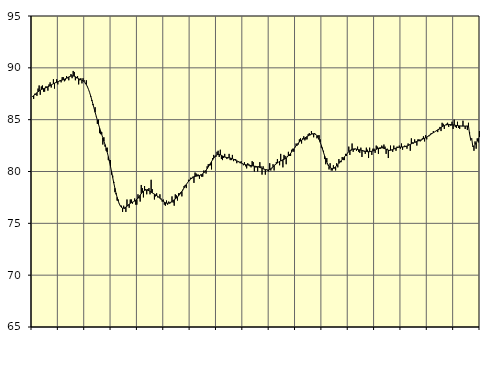
| Category | Piggar | Series 1 |
|---|---|---|
| nan | 87.2 | 87.24 |
| 87.0 | 87 | 87.31 |
| 87.0 | 87.5 | 87.4 |
| 87.0 | 87.4 | 87.5 |
| 87.0 | 87.3 | 87.6 |
| 87.0 | 88 | 87.69 |
| 87.0 | 88.3 | 87.77 |
| 87.0 | 87.4 | 87.84 |
| 87.0 | 88.2 | 87.9 |
| 87.0 | 88.3 | 87.95 |
| 87.0 | 87.7 | 87.99 |
| 87.0 | 87.7 | 88.03 |
| nan | 88.2 | 88.07 |
| 88.0 | 88.2 | 88.11 |
| 88.0 | 87.8 | 88.17 |
| 88.0 | 88.4 | 88.23 |
| 88.0 | 88.6 | 88.29 |
| 88.0 | 88.1 | 88.36 |
| 88.0 | 88.4 | 88.41 |
| 88.0 | 88.9 | 88.47 |
| 88.0 | 88 | 88.52 |
| 88.0 | 88.6 | 88.57 |
| 88.0 | 88.9 | 88.61 |
| 88.0 | 88.4 | 88.66 |
| nan | 88.7 | 88.7 |
| 89.0 | 88.8 | 88.75 |
| 89.0 | 88.6 | 88.79 |
| 89.0 | 89.1 | 88.82 |
| 89.0 | 89.1 | 88.86 |
| 89.0 | 88.7 | 88.9 |
| 89.0 | 88.8 | 88.95 |
| 89.0 | 89.2 | 89 |
| 89.0 | 89 | 89.06 |
| 89.0 | 88.8 | 89.12 |
| 89.0 | 89.2 | 89.17 |
| 89.0 | 89.4 | 89.21 |
| nan | 89 | 89.23 |
| 90.0 | 89.7 | 89.22 |
| 90.0 | 89.6 | 89.19 |
| 90.0 | 88.8 | 89.14 |
| 90.0 | 89 | 89.08 |
| 90.0 | 89.2 | 89.01 |
| 90.0 | 88.4 | 88.95 |
| 90.0 | 88.8 | 88.9 |
| 90.0 | 89 | 88.85 |
| 90.0 | 88.5 | 88.8 |
| 90.0 | 89 | 88.75 |
| 90.0 | 88.8 | 88.66 |
| nan | 88.5 | 88.54 |
| 91.0 | 88.8 | 88.38 |
| 91.0 | 88.2 | 88.17 |
| 91.0 | 87.9 | 87.91 |
| 91.0 | 87.6 | 87.61 |
| 91.0 | 87.2 | 87.27 |
| 91.0 | 86.8 | 86.89 |
| 91.0 | 86.4 | 86.51 |
| 91.0 | 86.1 | 86.11 |
| 91.0 | 86.2 | 85.71 |
| 91.0 | 85.3 | 85.33 |
| 91.0 | 84.6 | 84.95 |
| nan | 85 | 84.58 |
| 92.0 | 83.7 | 84.23 |
| 92.0 | 83.6 | 83.89 |
| 92.0 | 83.8 | 83.57 |
| 92.0 | 82.6 | 83.25 |
| 92.0 | 83.3 | 82.93 |
| 92.0 | 82.4 | 82.6 |
| 92.0 | 82 | 82.25 |
| 92.0 | 82.3 | 81.87 |
| 92.0 | 81.1 | 81.44 |
| 92.0 | 81.1 | 80.98 |
| 92.0 | 81.1 | 80.47 |
| nan | 79.7 | 79.95 |
| 93.0 | 79.6 | 79.42 |
| 93.0 | 79 | 78.89 |
| 93.0 | 78 | 78.39 |
| 93.0 | 77.8 | 77.92 |
| 93.0 | 77.2 | 77.51 |
| 93.0 | 77.3 | 77.16 |
| 93.0 | 76.9 | 76.88 |
| 93.0 | 76.7 | 76.67 |
| 93.0 | 76.7 | 76.54 |
| 93.0 | 76.1 | 76.47 |
| 93.0 | 76.7 | 76.46 |
| nan | 76.4 | 76.5 |
| 94.0 | 76.1 | 76.57 |
| 94.0 | 77.3 | 76.65 |
| 94.0 | 76.7 | 76.75 |
| 94.0 | 76.5 | 76.85 |
| 94.0 | 77.3 | 76.93 |
| 94.0 | 77.3 | 76.99 |
| 94.0 | 76.9 | 77.04 |
| 94.0 | 77.1 | 77.09 |
| 94.0 | 77.4 | 77.15 |
| 94.0 | 76.8 | 77.22 |
| 94.0 | 76.8 | 77.32 |
| nan | 77.8 | 77.44 |
| 95.0 | 77.4 | 77.57 |
| 95.0 | 77.1 | 77.72 |
| 95.0 | 78.7 | 77.86 |
| 95.0 | 78.4 | 77.99 |
| 95.0 | 77.5 | 78.1 |
| 95.0 | 78.6 | 78.18 |
| 95.0 | 78.3 | 78.21 |
| 95.0 | 77.8 | 78.22 |
| 95.0 | 78.3 | 78.19 |
| 95.0 | 78.4 | 78.14 |
| 95.0 | 77.8 | 78.08 |
| nan | 79.2 | 78.01 |
| 96.0 | 78.3 | 77.94 |
| 96.0 | 77.9 | 77.88 |
| 96.0 | 77.3 | 77.82 |
| 96.0 | 77.6 | 77.75 |
| 96.0 | 77.9 | 77.68 |
| 96.0 | 77.5 | 77.61 |
| 96.0 | 77.5 | 77.52 |
| 96.0 | 77.8 | 77.42 |
| 96.0 | 77.4 | 77.32 |
| 96.0 | 77.1 | 77.22 |
| 96.0 | 77.3 | 77.13 |
| nan | 76.8 | 77.05 |
| 97.0 | 76.7 | 76.99 |
| 97.0 | 77.2 | 76.95 |
| 97.0 | 76.8 | 76.94 |
| 97.0 | 77.1 | 76.95 |
| 97.0 | 76.9 | 76.99 |
| 97.0 | 77 | 77.05 |
| 97.0 | 77.6 | 77.12 |
| 97.0 | 77 | 77.19 |
| 97.0 | 76.7 | 77.27 |
| 97.0 | 77.8 | 77.35 |
| 97.0 | 77.7 | 77.44 |
| nan | 77.2 | 77.54 |
| 98.0 | 77.9 | 77.66 |
| 98.0 | 77.9 | 77.79 |
| 98.0 | 78 | 77.93 |
| 98.0 | 77.6 | 78.08 |
| 98.0 | 78.2 | 78.25 |
| 98.0 | 78.6 | 78.42 |
| 98.0 | 78.7 | 78.58 |
| 98.0 | 78.4 | 78.74 |
| 98.0 | 78.9 | 78.9 |
| 98.0 | 79.2 | 79.04 |
| 98.0 | 79.1 | 79.17 |
| nan | 79.4 | 79.28 |
| 99.0 | 79.3 | 79.37 |
| 99.0 | 79.5 | 79.44 |
| 99.0 | 78.9 | 79.49 |
| 99.0 | 79.9 | 79.53 |
| 99.0 | 79.8 | 79.55 |
| 99.0 | 79.7 | 79.57 |
| 99.0 | 79.7 | 79.58 |
| 99.0 | 79.3 | 79.61 |
| 99.0 | 79.7 | 79.65 |
| 99.0 | 79.5 | 79.7 |
| 99.0 | 79.5 | 79.78 |
| nan | 80.1 | 79.87 |
| 0.0 | 80 | 79.98 |
| 0.0 | 79.8 | 80.12 |
| 0.0 | 80.5 | 80.26 |
| 0.0 | 80.7 | 80.43 |
| 0.0 | 80.7 | 80.6 |
| 0.0 | 80.6 | 80.78 |
| 0.0 | 80.2 | 80.96 |
| 0.0 | 81.3 | 81.13 |
| 0.0 | 81.6 | 81.29 |
| 0.0 | 81.4 | 81.43 |
| 0.0 | 81.4 | 81.54 |
| nan | 81.9 | 81.61 |
| 1.0 | 82 | 81.64 |
| 1.0 | 81.4 | 81.64 |
| 1.0 | 82.1 | 81.61 |
| 1.0 | 81.2 | 81.56 |
| 1.0 | 81.1 | 81.5 |
| 1.0 | 81.3 | 81.45 |
| 1.0 | 81.7 | 81.4 |
| 1.0 | 81.4 | 81.37 |
| 1.0 | 81.2 | 81.35 |
| 1.0 | 81.3 | 81.33 |
| 1.0 | 81.7 | 81.32 |
| nan | 81.1 | 81.3 |
| 2.0 | 81.1 | 81.27 |
| 2.0 | 81.6 | 81.23 |
| 2.0 | 81 | 81.18 |
| 2.0 | 81.2 | 81.13 |
| 2.0 | 81.2 | 81.08 |
| 2.0 | 80.8 | 81.03 |
| 2.0 | 81 | 80.98 |
| 2.0 | 80.9 | 80.93 |
| 2.0 | 80.8 | 80.87 |
| 2.0 | 81 | 80.82 |
| 2.0 | 80.8 | 80.77 |
| nan | 80.6 | 80.72 |
| 3.0 | 80.9 | 80.69 |
| 3.0 | 80.5 | 80.66 |
| 3.0 | 80.3 | 80.64 |
| 3.0 | 80.8 | 80.63 |
| 3.0 | 80.7 | 80.61 |
| 3.0 | 80.5 | 80.59 |
| 3.0 | 80.4 | 80.57 |
| 3.0 | 81 | 80.55 |
| 3.0 | 80.9 | 80.53 |
| 3.0 | 80 | 80.51 |
| 3.0 | 80.4 | 80.5 |
| nan | 80.4 | 80.48 |
| 4.0 | 80 | 80.46 |
| 4.0 | 80.5 | 80.43 |
| 4.0 | 80.9 | 80.39 |
| 4.0 | 80.5 | 80.35 |
| 4.0 | 79.7 | 80.31 |
| 4.0 | 80.5 | 80.27 |
| 4.0 | 80.2 | 80.23 |
| 4.0 | 79.7 | 80.19 |
| 4.0 | 80.2 | 80.16 |
| 4.0 | 80.1 | 80.15 |
| 4.0 | 80 | 80.16 |
| nan | 80.8 | 80.2 |
| 5.0 | 80.1 | 80.27 |
| 5.0 | 80.3 | 80.35 |
| 5.0 | 80.7 | 80.45 |
| 5.0 | 80.1 | 80.54 |
| 5.0 | 80.7 | 80.64 |
| 5.0 | 80.9 | 80.74 |
| 5.0 | 81.2 | 80.82 |
| 5.0 | 80.9 | 80.9 |
| 5.0 | 80.6 | 80.97 |
| 5.0 | 81.7 | 81.03 |
| 5.0 | 81 | 81.08 |
| nan | 80.4 | 81.13 |
| 6.0 | 81.6 | 81.18 |
| 6.0 | 81.5 | 81.24 |
| 6.0 | 80.7 | 81.31 |
| 6.0 | 81.5 | 81.4 |
| 6.0 | 81.9 | 81.5 |
| 6.0 | 81.5 | 81.62 |
| 6.0 | 81.5 | 81.75 |
| 6.0 | 82.1 | 81.89 |
| 6.0 | 82.2 | 82.03 |
| 6.0 | 81.9 | 82.18 |
| 6.0 | 82.3 | 82.33 |
| nan | 82.7 | 82.48 |
| 7.0 | 82.5 | 82.62 |
| 7.0 | 82.6 | 82.74 |
| 7.0 | 83.1 | 82.85 |
| 7.0 | 83.2 | 82.94 |
| 7.0 | 82.7 | 83.02 |
| 7.0 | 83.2 | 83.09 |
| 7.0 | 83.4 | 83.16 |
| 7.0 | 83 | 83.23 |
| 7.0 | 83.1 | 83.3 |
| 7.0 | 83.1 | 83.37 |
| 7.0 | 83.6 | 83.43 |
| nan | 83.7 | 83.5 |
| 8.0 | 83.5 | 83.56 |
| 8.0 | 83.9 | 83.6 |
| 8.0 | 83.6 | 83.64 |
| 8.0 | 83.3 | 83.64 |
| 8.0 | 83.7 | 83.62 |
| 8.0 | 83.6 | 83.56 |
| 8.0 | 83.2 | 83.45 |
| 8.0 | 83.5 | 83.29 |
| 8.0 | 83.5 | 83.07 |
| 8.0 | 83.1 | 82.81 |
| 8.0 | 82.3 | 82.51 |
| nan | 82.3 | 82.18 |
| 9.0 | 82 | 81.84 |
| 9.0 | 81.2 | 81.5 |
| 9.0 | 80.7 | 81.19 |
| 9.0 | 81.3 | 80.91 |
| 9.0 | 80.6 | 80.67 |
| 9.0 | 80.2 | 80.49 |
| 9.0 | 80.8 | 80.37 |
| 9.0 | 80.1 | 80.31 |
| 9.0 | 80.1 | 80.29 |
| 9.0 | 80.6 | 80.31 |
| 9.0 | 80.3 | 80.37 |
| nan | 80.1 | 80.45 |
| 10.0 | 80.8 | 80.55 |
| 10.0 | 80.4 | 80.66 |
| 10.0 | 81.2 | 80.78 |
| 10.0 | 81 | 80.9 |
| 10.0 | 80.9 | 81.03 |
| 10.0 | 81.4 | 81.15 |
| 10.0 | 81.1 | 81.28 |
| 10.0 | 81.1 | 81.41 |
| 10.0 | 81.7 | 81.54 |
| 10.0 | 81.5 | 81.67 |
| 10.0 | 81.8 | 81.79 |
| nan | 82.4 | 81.91 |
| 11.0 | 81.6 | 82.01 |
| 11.0 | 82 | 82.08 |
| 11.0 | 82.7 | 82.14 |
| 11.0 | 81.9 | 82.17 |
| 11.0 | 82.1 | 82.18 |
| 11.0 | 82.2 | 82.17 |
| 11.0 | 82 | 82.15 |
| 11.0 | 82.4 | 82.13 |
| 11.0 | 81.9 | 82.11 |
| 11.0 | 81.8 | 82.09 |
| 11.0 | 82.3 | 82.06 |
| nan | 81.4 | 82.03 |
| 12.0 | 82 | 82.01 |
| 12.0 | 81.9 | 81.98 |
| 12.0 | 81.7 | 81.95 |
| 12.0 | 82.3 | 81.93 |
| 12.0 | 82.1 | 81.91 |
| 12.0 | 81.3 | 81.91 |
| 12.0 | 82.3 | 81.91 |
| 12.0 | 81.9 | 81.93 |
| 12.0 | 81.6 | 81.95 |
| 12.0 | 82.2 | 81.98 |
| 12.0 | 82.2 | 82.03 |
| nan | 81.8 | 82.07 |
| 13.0 | 82.5 | 82.13 |
| 13.0 | 82.4 | 82.19 |
| 13.0 | 81.7 | 82.24 |
| 13.0 | 82.2 | 82.28 |
| 13.0 | 82.2 | 82.29 |
| 13.0 | 82.5 | 82.29 |
| 13.0 | 82.4 | 82.27 |
| 13.0 | 82.6 | 82.23 |
| 13.0 | 82.4 | 82.19 |
| 13.0 | 81.7 | 82.14 |
| 13.0 | 82.2 | 82.1 |
| nan | 81.3 | 82.06 |
| 14.0 | 82 | 82.04 |
| 14.0 | 82.5 | 82.05 |
| 14.0 | 82.1 | 82.07 |
| 14.0 | 81.9 | 82.11 |
| 14.0 | 82.5 | 82.16 |
| 14.0 | 82.2 | 82.22 |
| 14.0 | 82 | 82.26 |
| 14.0 | 82.4 | 82.3 |
| 14.0 | 82.3 | 82.33 |
| 14.0 | 82.5 | 82.34 |
| 14.0 | 82.2 | 82.35 |
| nan | 82.7 | 82.36 |
| 15.0 | 82.1 | 82.37 |
| 15.0 | 82.4 | 82.38 |
| 15.0 | 82.5 | 82.4 |
| 15.0 | 82.4 | 82.42 |
| 15.0 | 82.2 | 82.46 |
| 15.0 | 82.7 | 82.5 |
| 15.0 | 82.6 | 82.56 |
| 15.0 | 82 | 82.61 |
| 15.0 | 83.2 | 82.67 |
| 15.0 | 82.8 | 82.72 |
| 15.0 | 82.7 | 82.77 |
| nan | 83.1 | 82.82 |
| 16.0 | 82.8 | 82.86 |
| 16.0 | 82.5 | 82.9 |
| 16.0 | 83.1 | 82.94 |
| 16.0 | 83.1 | 82.98 |
| 16.0 | 82.9 | 83.02 |
| 16.0 | 83 | 83.06 |
| 16.0 | 83.2 | 83.11 |
| 16.0 | 83.4 | 83.16 |
| 16.0 | 82.9 | 83.21 |
| 16.0 | 83.5 | 83.26 |
| 16.0 | 83.1 | 83.32 |
| nan | 83.4 | 83.39 |
| 17.0 | 83.4 | 83.46 |
| 17.0 | 83.5 | 83.53 |
| 17.0 | 83.7 | 83.61 |
| 17.0 | 83.7 | 83.68 |
| 17.0 | 83.9 | 83.74 |
| 17.0 | 83.8 | 83.81 |
| 17.0 | 83.9 | 83.88 |
| 17.0 | 83.9 | 83.95 |
| 17.0 | 83.8 | 84.02 |
| 17.0 | 84 | 84.09 |
| 17.0 | 84.3 | 84.17 |
| nan | 83.9 | 84.24 |
| 18.0 | 84.7 | 84.31 |
| 18.0 | 84.6 | 84.38 |
| 18.0 | 84.1 | 84.43 |
| 18.0 | 84.5 | 84.48 |
| 18.0 | 84.6 | 84.5 |
| 18.0 | 84.7 | 84.52 |
| 18.0 | 84.3 | 84.53 |
| 18.0 | 84.5 | 84.53 |
| 18.0 | 84.4 | 84.53 |
| 18.0 | 84.8 | 84.51 |
| 18.0 | 84.1 | 84.5 |
| nan | 85 | 84.48 |
| 19.0 | 84.3 | 84.46 |
| 19.0 | 84.2 | 84.44 |
| 19.0 | 84.8 | 84.43 |
| 19.0 | 84.2 | 84.41 |
| 19.0 | 84.1 | 84.4 |
| 19.0 | 84.4 | 84.39 |
| 19.0 | 84.4 | 84.38 |
| 19.0 | 84.9 | 84.38 |
| 19.0 | 84.4 | 84.38 |
| 19.0 | 84.1 | 84.38 |
| 19.0 | 84.4 | 84.38 |
| nan | 84 | 84.39 |
| 20.0 | 84.7 | 84.39 |
| 20.0 | 83.8 | 83.63 |
| 20.0 | 83 | 83.09 |
| 20.0 | 83.2 | 83.15 |
| 20.0 | 82.4 | 82.37 |
| 20.0 | 82 | 82.48 |
| 20.0 | 82.9 | 82.62 |
| 20.0 | 82.2 | 82.77 |
| 20.0 | 83.2 | 82.95 |
| 20.0 | 82.8 | 83.13 |
| 20.0 | 83.9 | 83.32 |